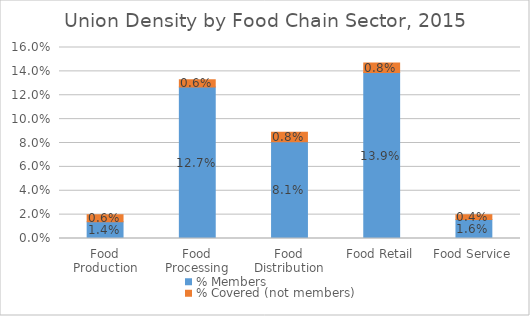
| Category | % Members | % Covered (not members) |
|---|---|---|
| Food Production | 0.014 | 0.006 |
| Food Processing | 0.127 | 0.006 |
| Food Distribution | 0.081 | 0.008 |
| Food Retail | 0.139 | 0.008 |
| Food Service | 0.016 | 0.004 |